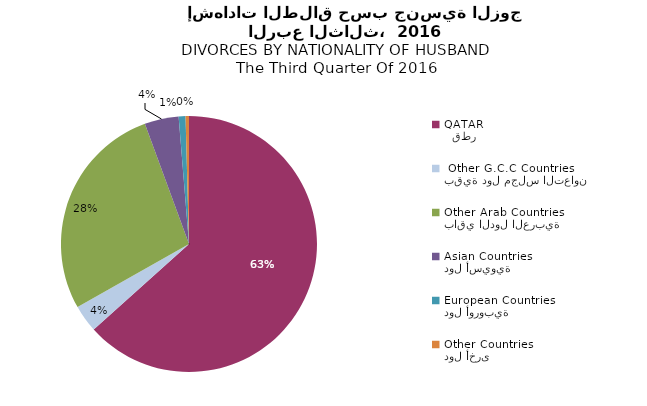
| Category | Series 1 |
|---|---|
|   قطر
QATAR | 147 |
| بقية دول مجلس التعاون
 Other G.C.C Countries | 8 |
| باقي الدول العربية
Other Arab Countries | 64 |
| دول أسيوية
Asian Countries | 10 |
| دول أوروبية
European Countries | 2 |
| دول أخرى
Other Countries | 1 |